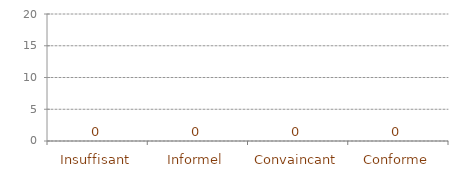
| Category | Conformités | moyenne |
|---|---|---|
| Insuffisant | 0 | 0 |
| Informel | 0 | 0 |
| Convaincant | 0 | 0 |
| Conforme | 0 | 0 |